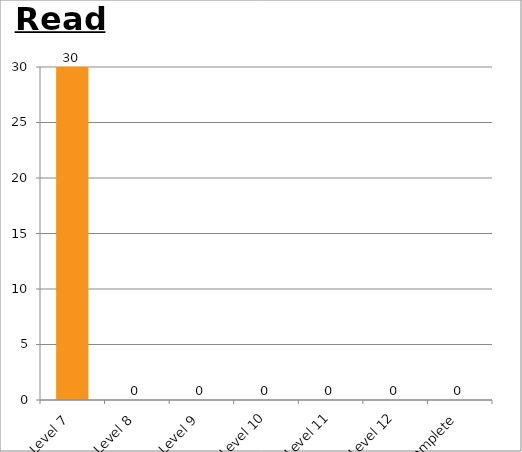
| Category | Series 0 |
|---|---|
| Level 7 | 30 |
| Level 8 | 0 |
| Level 9 | 0 |
| Level 10 | 0 |
| Level 11 | 0 |
| Level 12 | 0 |
| Complete | 0 |